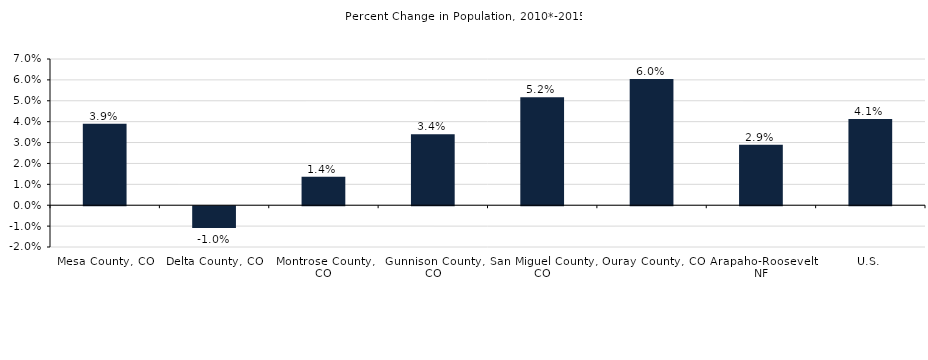
| Category | Population Percent Change (2008*-2012*) |
|---|---|
| Gallatin County, MT | 0.332 |
| County Region | 0.276 |
| U.S. | 0.08 |